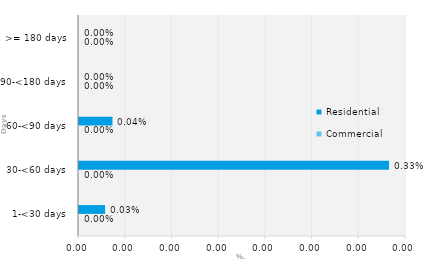
| Category | Commercial | Residential |
|---|---|---|
| 1-<30 days | 0 | 0 |
| 30-<60 days | 0 | 0.003 |
| 60-<90 days | 0 | 0 |
| 90-<180 days | 0 | 0 |
| >= 180 days | 0 | 0 |